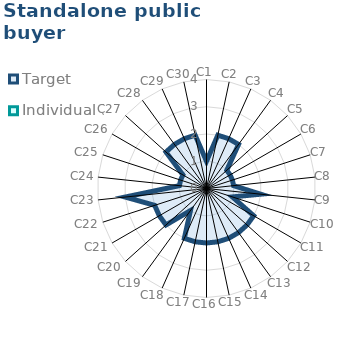
| Category | Target | Individual 3 |
|---|---|---|
| C1 | 1 | 0 |
| C2 | 2 | 0 |
| C3 | 2 | 0 |
| C4 | 2 | 0 |
| C5 | 1 | 0 |
| C6 | 1 | 0 |
| C7 | 1 | 0 |
| C8 | 1 | 0 |
| C9 | 2 | 0 |
| C10 | 1 | 0 |
| C11 | 2 | 0 |
| C12 | 2 | 0 |
| C13 | 2 | 0 |
| C14 | 2 | 0 |
| C15 | 2 | 0 |
| C16 | 2 | 0 |
| C17 | 2 | 0 |
| C18 | 2 | 0 |
| C19 | 1 | 0 |
| C20 | 2 | 0 |
| C21 | 2 | 0 |
| C22 | 2 | 0 |
| C23 | 3 | 0 |
| C24 | 1 | 0 |
| C25 | 1 | 0 |
| C26 | 1 | 0 |
| C27 | 2 | 0 |
| C28 | 2 | 0 |
| C29 | 2 | 0 |
| C30 | 2 | 0 |